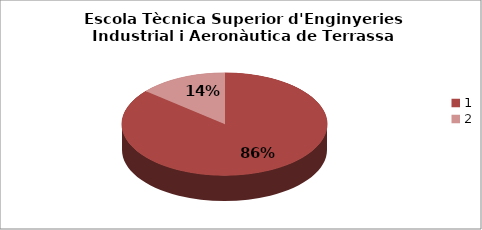
| Category | Escola Tècnica Superior d'Enginyeries Industrial i Aeronàutica de Terrassa (ETSEIAT) - Gènere |
|---|---|
| 0 | 0.861 |
| 1 | 0.139 |